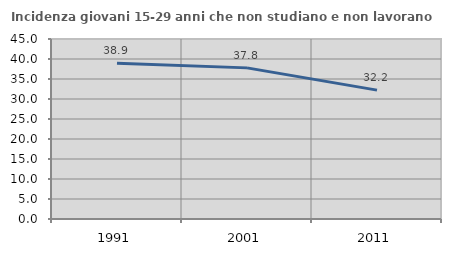
| Category | Incidenza giovani 15-29 anni che non studiano e non lavorano  |
|---|---|
| 1991.0 | 38.947 |
| 2001.0 | 37.781 |
| 2011.0 | 32.216 |